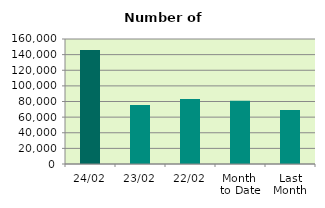
| Category | Series 0 |
|---|---|
| 24/02 | 145948 |
| 23/02 | 75386 |
| 22/02 | 83152 |
| Month 
to Date | 80818.444 |
| Last
Month | 69227.8 |